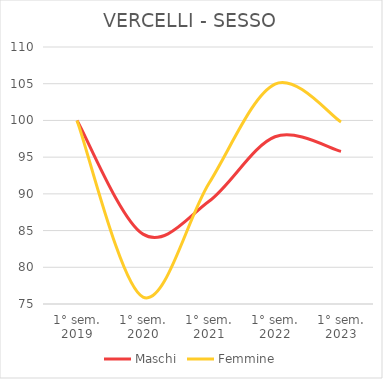
| Category | Maschi | Femmine |
|---|---|---|
| 1° sem.
2019 | 100 | 100 |
| 1° sem.
2020 | 84.514 | 75.938 |
| 1° sem.
2021 | 88.989 | 91.44 |
| 1° sem.
2022 | 97.778 | 104.948 |
| 1° sem.
2023 | 95.782 | 99.789 |